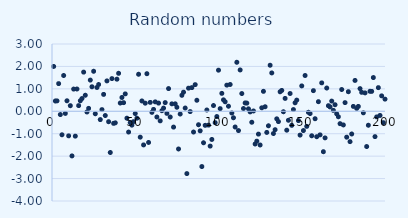
| Category | Series 0 |
|---|---|
| 0 | 1.999 |
| 1 | 0.458 |
| 2 | 0.464 |
| 3 | 1.233 |
| 4 | -0.146 |
| 5 | -1.047 |
| 6 | 1.595 |
| 7 | -0.096 |
| 8 | 0.469 |
| 9 | -1.094 |
| 10 | 0.249 |
| 11 | -1.99 |
| 12 | 0.99 |
| 13 | -1.108 |
| 14 | 0.993 |
| 15 | 0.253 |
| 16 | 0.47 |
| 17 | 0.568 |
| 18 | 1.747 |
| 19 | 0.715 |
| 20 | -0.032 |
| 21 | 0.131 |
| 22 | 1.392 |
| 23 | 1.093 |
| 24 | 1.784 |
| 25 | -0.11 |
| 26 | 1.062 |
| 27 | 1.194 |
| 28 | -0.37 |
| 29 | 0.075 |
| 30 | 0.754 |
| 31 | -0.189 |
| 32 | 1.355 |
| 33 | -0.464 |
| 34 | -1.838 |
| 35 | 1.457 |
| 36 | -0.537 |
| 37 | -0.514 |
| 38 | 1.432 |
| 39 | 1.693 |
| 40 | 0.368 |
| 41 | 0.616 |
| 42 | 0.384 |
| 43 | 0.775 |
| 44 | -0.309 |
| 45 | -0.925 |
| 46 | -0.505 |
| 47 | -0.618 |
| 48 | -0.461 |
| 49 | -0.1 |
| 50 | -0.309 |
| 51 | 1.651 |
| 52 | -1.153 |
| 53 | 0.462 |
| 54 | -1.5 |
| 55 | 0.362 |
| 56 | 1.675 |
| 57 | -1.39 |
| 58 | 0.398 |
| 59 | -0.048 |
| 60 | 0.085 |
| 61 | 0.421 |
| 62 | -0.256 |
| 63 | 0.366 |
| 64 | -0.427 |
| 65 | 0.027 |
| 66 | 0.143 |
| 67 | 0.387 |
| 68 | -0.093 |
| 69 | 1.012 |
| 70 | -0.256 |
| 71 | 0.332 |
| 72 | -0.704 |
| 73 | 0.332 |
| 74 | 0.18 |
| 75 | -1.68 |
| 76 | -0.122 |
| 77 | 0.713 |
| 78 | 0.852 |
| 79 | 0.145 |
| 80 | -2.778 |
| 81 | 1.031 |
| 82 | -0.015 |
| 83 | 1.055 |
| 84 | -0.924 |
| 85 | 1.188 |
| 86 | 0.491 |
| 87 | -0.599 |
| 88 | -0.872 |
| 89 | -2.463 |
| 90 | -1.404 |
| 91 | -0.626 |
| 92 | 0.057 |
| 93 | -0.618 |
| 94 | -1.552 |
| 95 | -1.256 |
| 96 | 0.256 |
| 97 | -0.508 |
| 98 | -0.234 |
| 99 | 1.833 |
| 100 | 0.118 |
| 101 | 0.799 |
| 102 | 0.51 |
| 103 | 0.424 |
| 104 | 1.166 |
| 105 | 0.226 |
| 106 | 1.195 |
| 107 | -0.077 |
| 108 | -0.289 |
| 109 | -0.7 |
| 110 | 2.185 |
| 111 | -0.86 |
| 112 | 1.843 |
| 113 | 0.791 |
| 114 | 0.123 |
| 115 | 0.372 |
| 116 | 0.366 |
| 117 | 0.11 |
| 118 | -0.028 |
| 119 | -0.489 |
| 120 | 0.015 |
| 121 | -1.459 |
| 122 | -1.33 |
| 123 | -1.017 |
| 124 | -1.503 |
| 125 | 0.155 |
| 126 | 0.89 |
| 127 | 0.202 |
| 128 | -0.942 |
| 129 | -0.646 |
| 130 | 2.053 |
| 131 | 1.71 |
| 132 | -0.991 |
| 133 | -0.82 |
| 134 | -0.336 |
| 135 | -0.46 |
| 136 | 0.87 |
| 137 | 0.93 |
| 138 | -0.02 |
| 139 | 0.575 |
| 140 | -0.842 |
| 141 | -0.401 |
| 142 | 0.792 |
| 143 | -0.625 |
| 144 | 0.076 |
| 145 | 0.379 |
| 146 | 0.499 |
| 147 | -0.415 |
| 148 | -1.062 |
| 149 | 1.131 |
| 150 | -0.859 |
| 151 | 1.595 |
| 152 | -0.673 |
| 153 | -0.044 |
| 154 | -0.101 |
| 155 | -1.093 |
| 156 | 0.92 |
| 157 | -0.332 |
| 158 | -1.134 |
| 159 | 0.429 |
| 160 | -1.052 |
| 161 | 1.266 |
| 162 | -1.803 |
| 163 | -1.186 |
| 164 | 1.036 |
| 165 | 0.249 |
| 166 | 0.194 |
| 167 | 0.455 |
| 168 | 0.041 |
| 169 | 0.292 |
| 170 | -0.113 |
| 171 | -0.244 |
| 172 | -0.553 |
| 173 | 0.971 |
| 174 | -0.609 |
| 175 | 0.387 |
| 176 | -1.155 |
| 177 | 0.874 |
| 178 | -1.354 |
| 179 | -1.012 |
| 180 | 0.217 |
| 181 | 1.375 |
| 182 | 0.13 |
| 183 | 0.218 |
| 184 | 1.011 |
| 185 | 0.846 |
| 186 | -0.068 |
| 187 | 0.82 |
| 188 | -1.572 |
| 189 | -0.622 |
| 190 | 0.891 |
| 191 | 0.888 |
| 192 | 1.504 |
| 193 | -1.13 |
| 194 | -0.25 |
| 195 | 1.054 |
| 196 | -0.187 |
| 197 | 0.688 |
| 198 | -0.507 |
| 199 | 0.542 |